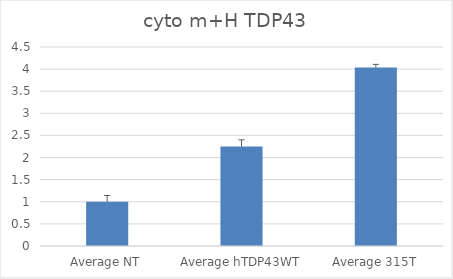
| Category | Series 0 |
|---|---|
| Average NT | 1 |
| Average hTDP43WT | 2.252 |
| Average 315T | 4.036 |